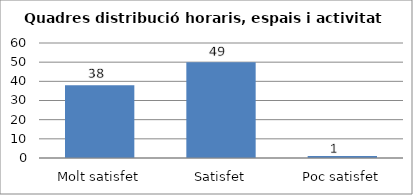
| Category | Series 0 |
|---|---|
| Molt satisfet | 38 |
| Satisfet | 50 |
| Poc satisfet | 1 |